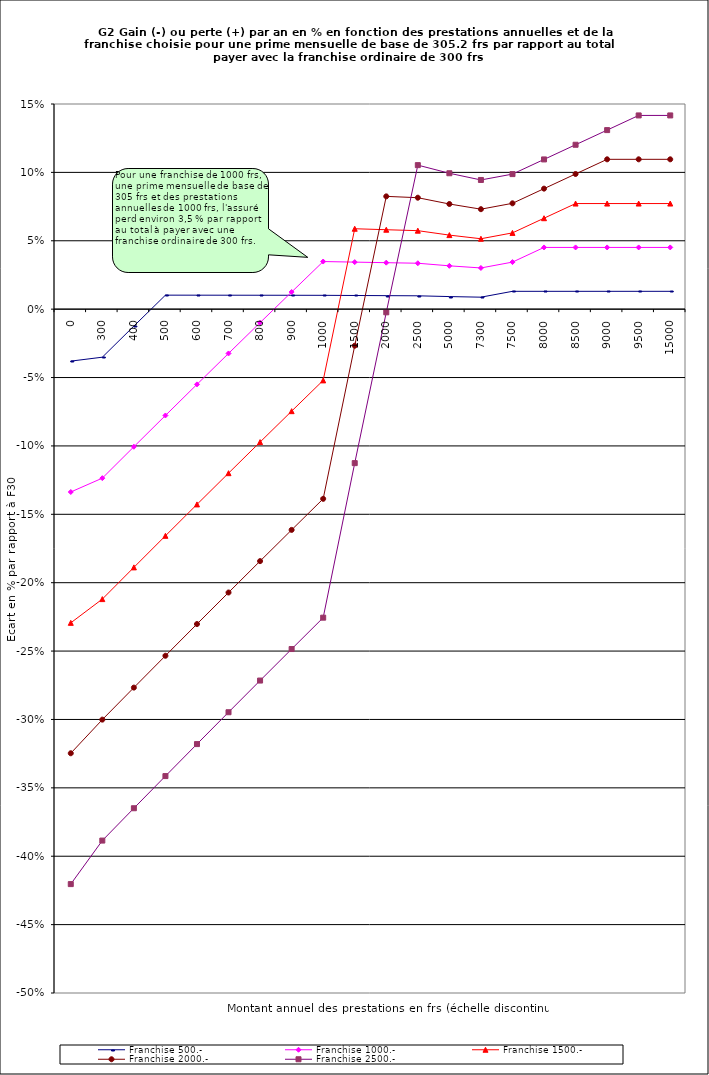
| Category | Franchise 500.- | Franchise 1000.- | Franchise 1500.- | Franchise 2000.- | Franchise 2500.- |
|---|---|---|---|---|---|
| 0.0 | -0.038 | -0.134 | -0.229 | -0.325 | -0.42 |
| 300.0 | -0.035 | -0.124 | -0.212 | -0.3 | -0.389 |
| 400.0 | -0.012 | -0.101 | -0.189 | -0.277 | -0.365 |
| 500.0 | 0.01 | -0.078 | -0.166 | -0.253 | -0.341 |
| 600.0 | 0.01 | -0.055 | -0.143 | -0.23 | -0.318 |
| 700.0 | 0.01 | -0.032 | -0.12 | -0.207 | -0.295 |
| 800.0 | 0.01 | -0.01 | -0.097 | -0.184 | -0.272 |
| 900.0 | 0.01 | 0.013 | -0.075 | -0.161 | -0.249 |
| 1000.0 | 0.01 | 0.035 | -0.052 | -0.139 | -0.226 |
| 1500.0 | 0.01 | 0.034 | 0.059 | -0.027 | -0.113 |
| 2000.0 | 0.01 | 0.034 | 0.058 | 0.082 | -0.002 |
| 2500.0 | 0.01 | 0.034 | 0.057 | 0.081 | 0.105 |
| 5000.0 | 0.009 | 0.032 | 0.054 | 0.077 | 0.099 |
| 7300.0 | 0.009 | 0.03 | 0.051 | 0.073 | 0.094 |
| 7500.0 | 0.013 | 0.034 | 0.056 | 0.077 | 0.099 |
| 8000.0 | 0.013 | 0.045 | 0.066 | 0.088 | 0.109 |
| 8500.0 | 0.013 | 0.045 | 0.077 | 0.099 | 0.12 |
| 9000.0 | 0.013 | 0.045 | 0.077 | 0.11 | 0.131 |
| 9500.0 | 0.013 | 0.045 | 0.077 | 0.11 | 0.142 |
| 15000.0 | 0.013 | 0.045 | 0.077 | 0.11 | 0.142 |